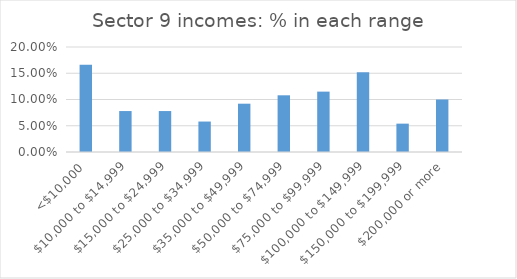
| Category | Series 0 |
|---|---|
| <$10,000 | 0.166 |
| $10,000 to $14,999 | 0.078 |
| $15,000 to $24,999 | 0.078 |
| $25,000 to $34,999 | 0.058 |
| $35,000 to $49,999 | 0.092 |
| $50,000 to $74,999 | 0.108 |
| $75,000 to $99,999 | 0.115 |
| $100,000 to $149,999 | 0.152 |
| $150,000 to $199,999 | 0.054 |
| $200,000 or more | 0.1 |